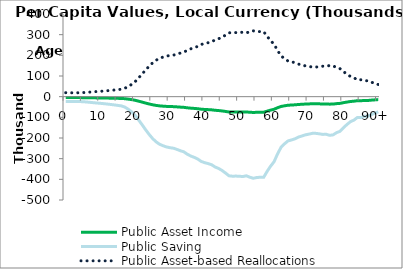
| Category | Public Asset Income | Public Saving | Public Asset-based Reallocations |
|---|---|---|---|
| 0 | -4622.009 | -23887.988 | 19265.979 |
|  | -4537.932 | -23453.453 | 18915.52 |
| 2 | -4453.855 | -23018.917 | 18565.062 |
| 3 | -4455.023 | -23024.954 | 18569.931 |
| 4 | -4566.465 | -23600.917 | 19034.452 |
| 5 | -4723.353 | -24411.765 | 19688.412 |
| 6 | -4979.345 | -25734.814 | 20755.468 |
| 7 | -5314.394 | -27466.448 | 22152.055 |
| 8 | -5649.924 | -29200.573 | 23550.649 |
| 9 | -5951.127 | -30757.287 | 24806.159 |
| 10 | -6238.368 | -32241.838 | 26003.47 |
| 11 | -6567.236 | -33941.531 | 27374.295 |
| 12 | -6924.569 | -35788.335 | 28863.767 |
| 13 | -7321.28 | -37838.667 | 30517.386 |
| 14 | -7731.874 | -39960.74 | 32228.867 |
| 15 | -8185.232 | -42303.839 | 34118.607 |
| 16 | -8625.617 | -44579.888 | 35954.27 |
| 17 | -9753.569 | -50409.496 | 40655.926 |
| 18 | -11754.046 | -60748.587 | 48994.54 |
| 19 | -14303.12 | -73922.994 | 59619.875 |
| 20 | -17495.965 | -90424.615 | 72928.651 |
| 21 | -21845.179 | -112902.713 | 91057.534 |
| 22 | -26322.766 | -136044.285 | 109721.519 |
| 23 | -30960.889 | -160015.555 | 129054.666 |
| 24 | -35300.091 | -182441.906 | 147141.815 |
| 25 | -39147.965 | -202328.921 | 163180.956 |
| 26 | -42253.94 | -218381.575 | 176127.634 |
| 27 | -44496.282 | -229970.696 | 185474.415 |
| 28 | -45918.241 | -237319.825 | 191401.584 |
| 29 | -47062.874 | -243235.649 | 196172.775 |
| 30 | -47767.958 | -246879.741 | 199111.784 |
| 31 | -48245.879 | -249349.788 | 201103.909 |
| 32 | -49347.8 | -255044.857 | 205697.058 |
| 33 | -50592.693 | -261478.858 | 210886.165 |
| 34 | -51652.833 | -266957.991 | 215305.158 |
| 35 | -53866.357 | -278398.177 | 224531.819 |
| 36 | -55559.185 | -287147.24 | 231588.055 |
| 37 | -56815.275 | -293639.106 | 236823.831 |
| 38 | -58342.335 | -301531.428 | 243189.093 |
| 39 | -60615.208 | -313278.345 | 252663.137 |
| 40 | -61782.246 | -319309.965 | 257527.719 |
| 41 | -62651.505 | -323802.565 | 261151.06 |
| 42 | -63721.093 | -329330.53 | 265609.437 |
| 43 | -65841.285 | -340288.349 | 274447.063 |
| 44 | -67184.219 | -347229.047 | 280044.829 |
| 45 | -69054.746 | -356896.517 | 287841.771 |
| 46 | -71470.312 | -369380.92 | 297910.608 |
| 47 | -74077.218 | -382854.222 | 308777.004 |
| 48 | -74457.391 | -384819.078 | 310361.687 |
| 49 | -74357.404 | -384302.314 | 309944.909 |
| 50 | -74526.792 | -385177.763 | 310650.971 |
| 51 | -74783.039 | -386502.126 | 311719.087 |
| 52 | -74075.576 | -382845.735 | 308770.16 |
| 53 | -75391.292 | -389645.771 | 314254.479 |
| 54 | -76394.962 | -394833.047 | 318438.085 |
| 55 | -75706.112 | -391272.856 | 315566.744 |
| 56 | -75447.148 | -389934.45 | 314487.302 |
| 57 | -75500.368 | -390209.509 | 314709.141 |
| 58 | -69947.206 | -361509.032 | 291561.826 |
| 59 | -65085.118 | -336380.239 | 271295.121 |
| 60 | -60868.259 | -314586.195 | 253717.936 |
| 61 | -53589.29 | -276966.207 | 223376.917 |
| 62 | -47442.311 | -245196.698 | 197754.387 |
| 63 | -44155.626 | -228210.082 | 184054.456 |
| 64 | -41441.038 | -214180.242 | 172739.204 |
| 65 | -40513.829 | -209388.136 | 168874.307 |
| 66 | -39459.84 | -203940.792 | 164480.952 |
| 67 | -37848.1 | -195610.817 | 157762.716 |
| 68 | -36818.434 | -190289.18 | 153470.745 |
| 69 | -35754.009 | -184787.895 | 149033.886 |
| 70 | -35101.142 | -181413.677 | 146312.535 |
| 71 | -34365.826 | -177613.331 | 143247.506 |
| 72 | -34353.547 | -177549.874 | 143196.327 |
| 73 | -34772.425 | -179714.763 | 144942.339 |
| 74 | -35327.093 | -182581.461 | 147254.368 |
| 75 | -35233.17 | -182096.04 | 146862.869 |
| 76 | -36192.569 | -187054.515 | 150861.946 |
| 77 | -35751.444 | -184774.64 | 149023.196 |
| 78 | -33671.313 | -174023.873 | 140352.56 |
| 79 | -32432.188 | -167619.685 | 135187.498 |
| 80 | -28998.382 | -149872.702 | 120874.321 |
| 81 | -26032.981 | -134546.585 | 108513.604 |
| 82 | -23387.161 | -120872.163 | 97485.001 |
| 83 | -21930.183 | -113342.042 | 91411.859 |
| 84 | -19427.645 | -100408.144 | 80980.499 |
| 85 | -19607.754 | -101339.002 | 81731.248 |
| 86 | -18429.007 | -95246.869 | 76817.862 |
| 87 | -18456.114 | -95386.969 | 76930.855 |
| 88 | -16792.376 | -86788.251 | 69995.875 |
| 89 | -15460.422 | -79904.293 | 64443.871 |
| 90+ | -14128.467 | -73020.335 | 58891.868 |